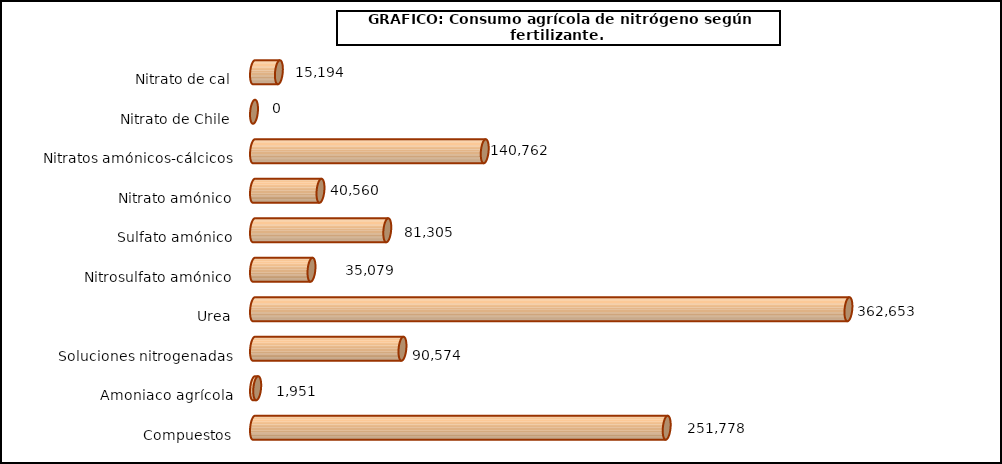
| Category | fert. N |
|---|---|
| 0 | 15194 |
| 1 | 0 |
| 2 | 140762 |
| 3 | 40560 |
| 4 | 81305 |
| 5 | 35079 |
| 6 | 362653 |
| 7 | 90574 |
| 8 | 1951 |
| 9 | 251778 |